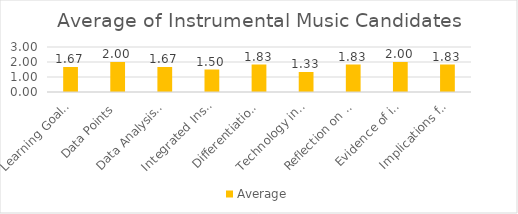
| Category | Average |
|---|---|
| Learning Goals Aligned with Pre-/Post-assessments ACEI 4.0 | 1.667 |
| Data Points | 2 |
| Data Analysis for Pedagogical Decisions ACEI 4.0 | 1.667 |
| Integrated Instruction ACEI 3.1 | 1.5 |
| Differentiation based on knowledge of individual learning ACEI 3.2 | 1.833 |
| Technology integration | 1.333 |
| Reflection on pedagogical decisions ACEI 1.0 | 1.833 |
| Evidence of impact on student learning ACEI 5.1 | 2 |
| Implications for teaching and professional development ACEI 5.1 | 1.833 |